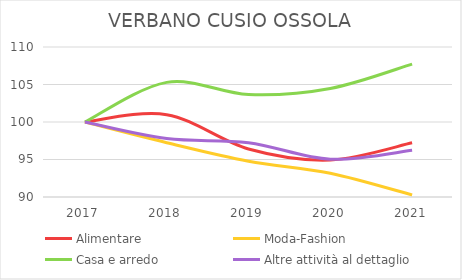
| Category | Alimentare | Moda-Fashion | Casa e arredo | Altre attività al dettaglio |
|---|---|---|---|---|
| 2017.0 | 100 | 100 | 100 | 100 |
| 2018.0 | 100.98 | 97.242 | 105.285 | 97.792 |
| 2019.0 | 96.405 | 94.775 | 103.659 | 97.24 |
| 2020.0 | 94.935 | 93.179 | 104.472 | 95.032 |
| 2021.0 | 97.222 | 90.276 | 107.724 | 96.228 |